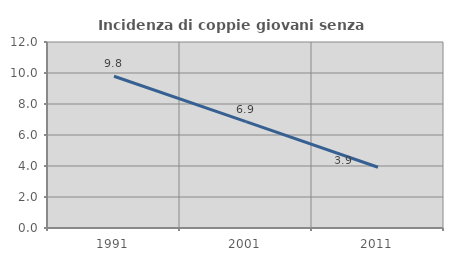
| Category | Incidenza di coppie giovani senza figli |
|---|---|
| 1991.0 | 9.791 |
| 2001.0 | 6.86 |
| 2011.0 | 3.921 |